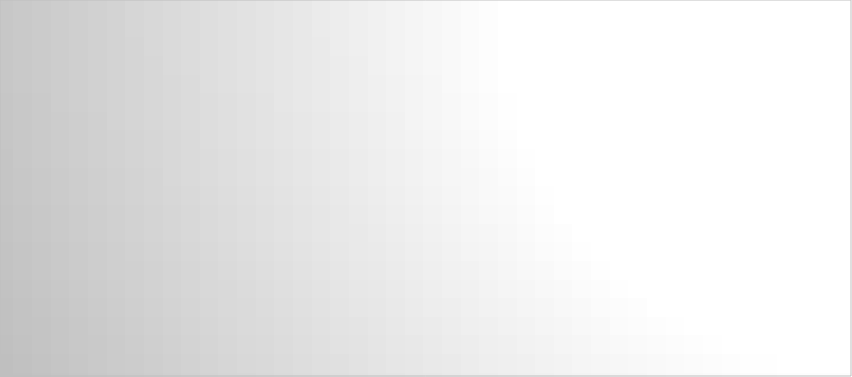
| Category | Total |
|---|---|
| 2009-1  | 415 |
| 2009-2  | 335 |
| 2009-3  | 361 |
| 2009-4  | 401 |
| 2010-1  | 455 |
| 2010-2  | 353 |
| 2010-3  | 414 |
| 2010-4  | 406 |
| 2011-1  | 428 |
| 2011-2  | 366 |
| 2011-3  | 383 |
| 2011-4  | 424 |
| 2012-1  | 421 |
| 2012-2  | 288 |
| 2012-3  | 335 |
| 2012-4  | 356 |
| 2013-1  | 364 |
| 2013-2  | 337 |
| 2013-3  | 391 |
| 2013-4  | 404 |
| 2014-1  | 441 |
| 2014-2  | 406 |